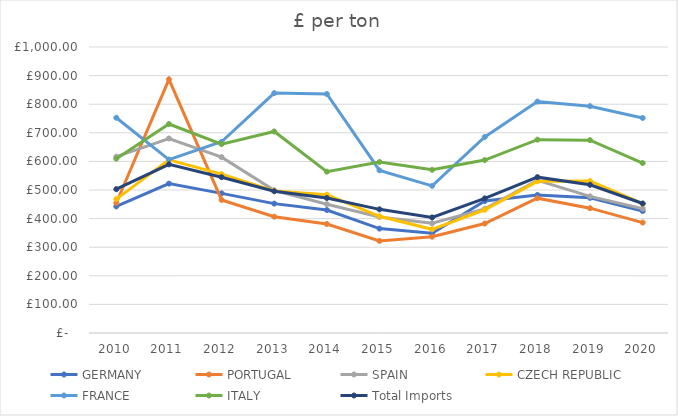
| Category | GERMANY | PORTUGAL | SPAIN | CZECH REPUBLIC | FRANCE | ITALY | Total Imports |
|---|---|---|---|---|---|---|---|
| 2010.0 | 442.512 | 454.581 | 616.411 | 468.182 | 752.601 | 609.593 | 502.793 |
| 2011.0 | 522.299 | 886.697 | 680.09 | 605.51 | 606.442 | 730.729 | 589.686 |
| 2012.0 | 488.214 | 465.345 | 615.008 | 555.351 | 668.574 | 660.483 | 544.817 |
| 2013.0 | 452.366 | 406.607 | 498.82 | 496.685 | 838.832 | 704.723 | 495.695 |
| 2014.0 | 430.091 | 381.048 | 450.282 | 483.79 | 835.613 | 564.081 | 472.03 |
| 2015.0 | 365.037 | 321.868 | 405.719 | 408.077 | 568.742 | 598.022 | 432.363 |
| 2016.0 | 348.847 | 336.663 | 383.499 | 362.523 | 514.552 | 570.553 | 404.031 |
| 2017.0 | 461.564 | 382.726 | 434.07 | 430.873 | 685.377 | 604.702 | 470.756 |
| 2018.0 | 482.544 | 471.379 | 533.869 | 530.26 | 809.268 | 676.081 | 544.881 |
| 2019.0 | 472.582 | 436.499 | 477.766 | 531.18 | 793.136 | 674.198 | 518.151 |
| 2020.0 | 426.451 | 386.093 | 434.715 | 452.101 | 751.843 | 594.218 | 452.757 |